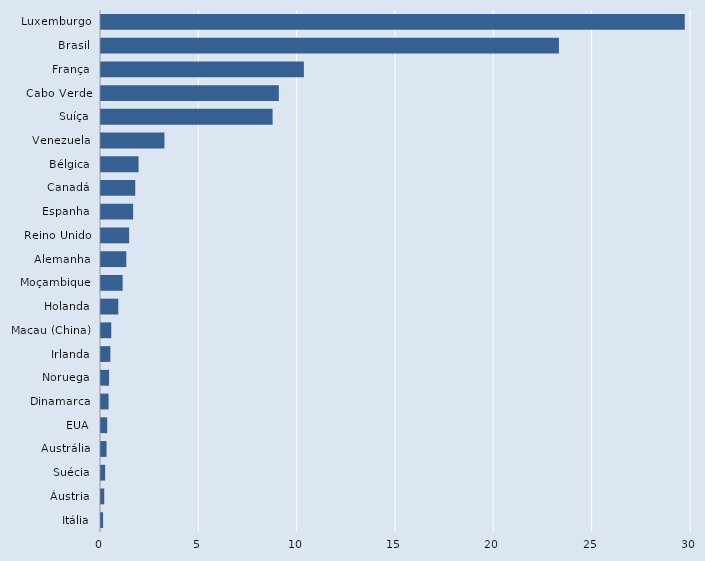
| Category | Series 0 |
|---|---|
| Itália | 0.107 |
| Áustria | 0.164 |
| Suécia | 0.212 |
| Austrália | 0.283 |
| EUA | 0.317 |
| Dinamarca | 0.385 |
| Noruega | 0.41 |
| Irlanda | 0.477 |
| Macau (China) | 0.521 |
| Holanda | 0.878 |
| Moçambique | 1.101 |
| Alemanha | 1.286 |
| Reino Unido | 1.431 |
| Espanha | 1.633 |
| Canadá | 1.742 |
| Bélgica | 1.91 |
| Venezuela | 3.227 |
| Suíça | 8.725 |
| Cabo Verde | 9.041 |
| França | 10.316 |
| Brasil | 23.284 |
| Luxemburgo | 29.682 |